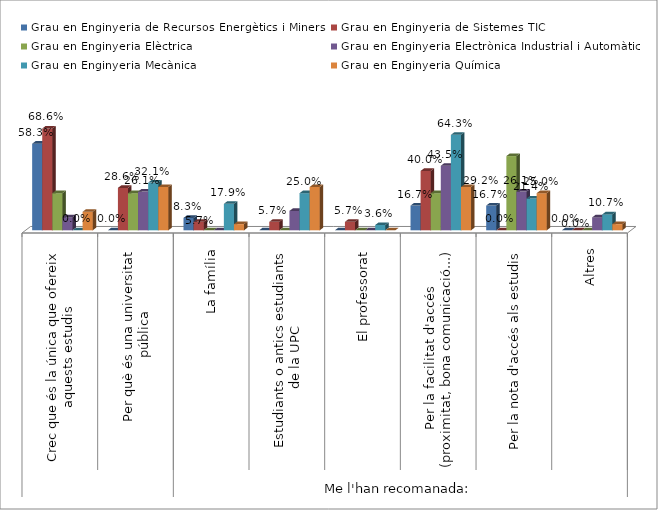
| Category | Grau en Enginyeria de Recursos Energètics i Miners | Grau en Enginyeria de Sistemes TIC | Grau en Enginyeria Elèctrica | Grau en Enginyeria Electrònica Industrial i Automàtica | Grau en Enginyeria Mecànica | Grau en Enginyeria Química |
|---|---|---|---|---|---|---|
| 0 | 0.583 | 0.686 | 0.25 | 0.087 | 0 | 0.125 |
| 1 | 0 | 0.286 | 0.25 | 0.261 | 0.321 | 0.292 |
| 2 | 0.083 | 0.057 | 0 | 0 | 0.179 | 0.042 |
| 3 | 0 | 0.057 | 0 | 0.13 | 0.25 | 0.292 |
| 4 | 0 | 0.057 | 0 | 0 | 0.036 | 0 |
| 5 | 0.167 | 0.4 | 0.25 | 0.435 | 0.643 | 0.292 |
| 6 | 0.167 | 0 | 0.5 | 0.261 | 0.214 | 0.25 |
| 7 | 0 | 0 | 0 | 0.087 | 0.107 | 0.042 |